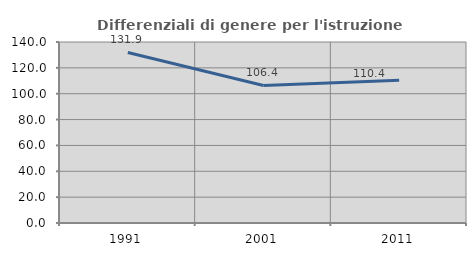
| Category | Differenziali di genere per l'istruzione superiore |
|---|---|
| 1991.0 | 131.894 |
| 2001.0 | 106.402 |
| 2011.0 | 110.433 |